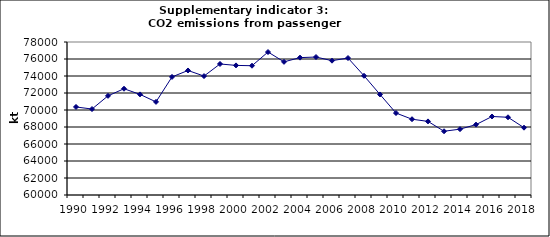
| Category | CO2 emissions from passenger cars, kt |
|---|---|
| 1990 | 70357.224 |
| 1991 | 70113.208 |
| 1992 | 71667.136 |
| 1993 | 72500.264 |
| 1994 | 71834.937 |
| 1995 | 70954.654 |
| 1996 | 73891.623 |
| 1997 | 74649.007 |
| 1998 | 73989.474 |
| 1999 | 75415.282 |
| 2000 | 75246.869 |
| 2001 | 75207.982 |
| 2002 | 76821.623 |
| 2003 | 75666.367 |
| 2004 | 76161.582 |
| 2005 | 76232.001 |
| 2006 | 75802.283 |
| 2007 | 76114.969 |
| 2008 | 74028.092 |
| 2009 | 71827.398 |
| 2010 | 69642.051 |
| 2011 | 68917.113 |
| 2012 | 68658.854 |
| 2013 | 67499.638 |
| 2014 | 67748.075 |
| 2015 | 68281.169 |
| 2016 | 69235.474 |
| 2017 | 69144.391 |
| 2018 | 67920.316 |